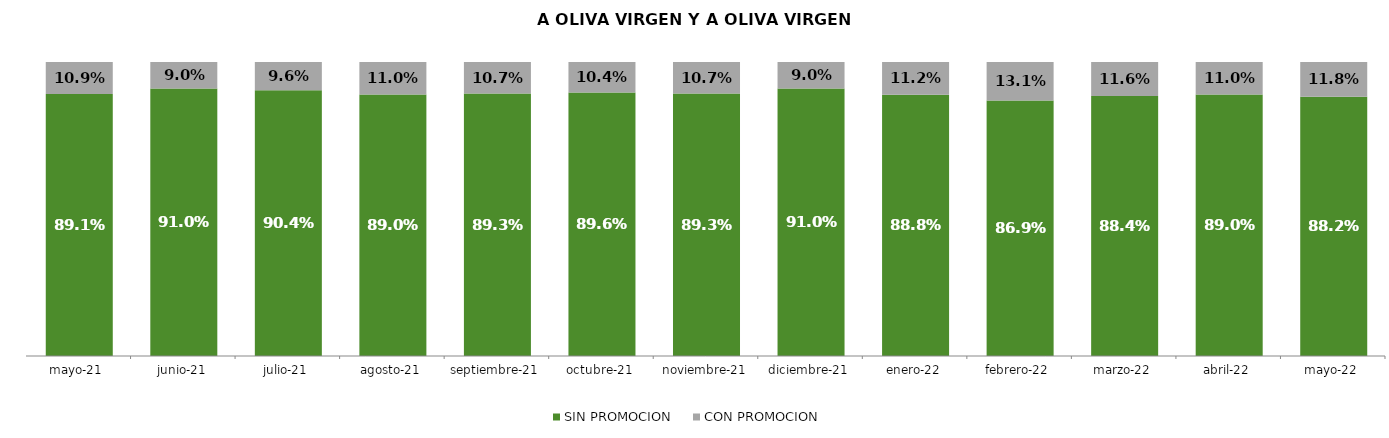
| Category | SIN PROMOCION   | CON PROMOCION   |
|---|---|---|
| 2021-05-01 | 0.891 | 0.109 |
| 2021-06-01 | 0.91 | 0.09 |
| 2021-07-01 | 0.904 | 0.096 |
| 2021-08-01 | 0.89 | 0.11 |
| 2021-09-01 | 0.893 | 0.107 |
| 2021-10-01 | 0.896 | 0.104 |
| 2021-11-01 | 0.893 | 0.107 |
| 2021-12-01 | 0.91 | 0.09 |
| 2022-01-01 | 0.888 | 0.112 |
| 2022-02-01 | 0.869 | 0.131 |
| 2022-03-01 | 0.884 | 0.116 |
| 2022-04-01 | 0.89 | 0.11 |
| 2022-05-01 | 0.882 | 0.118 |